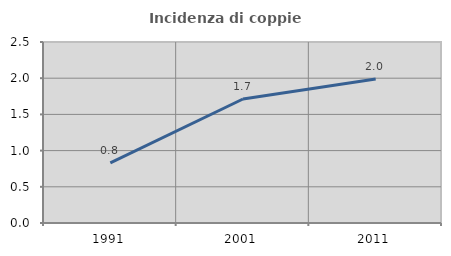
| Category | Incidenza di coppie miste |
|---|---|
| 1991.0 | 0.831 |
| 2001.0 | 1.713 |
| 2011.0 | 1.988 |